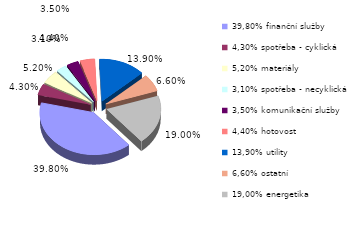
| Category | Series 0 |
|---|---|
| 39,80% finanční služby | 0.398 |
| 4,30% spotřeba - cyklická | 0.043 |
| 5,20% materiály | 0.052 |
| 3,10% spotřeba - necyklická | 0.031 |
| 3,50% komunikační služby | 0.035 |
| 4,40% hotovost | 0.044 |
| 13,90% utility | 0.139 |
| 6,60% ostatní | 0.066 |
| 19,00% energetika | 0.19 |